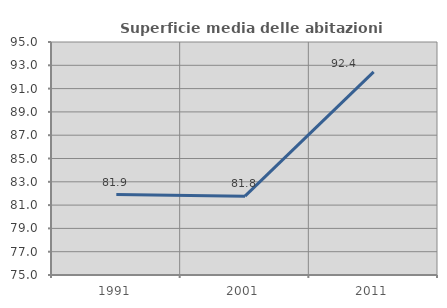
| Category | Superficie media delle abitazioni occupate |
|---|---|
| 1991.0 | 81.908 |
| 2001.0 | 81.768 |
| 2011.0 | 92.442 |